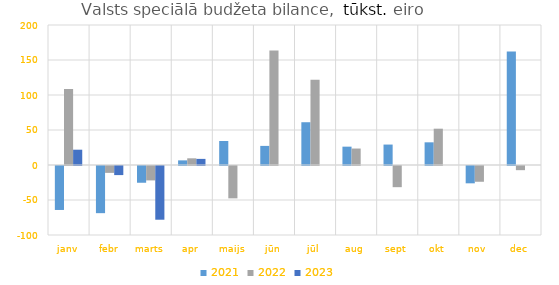
| Category | 2021 | 2022 | 2023 |
|---|---|---|---|
| janv | -62808.075 | 108554.179 | 21850.373 |
| febr | -67375.438 | -9818.538 | -12989.478 |
| marts | -23930.666 | -20590.078 | -76739.856 |
| apr | 6610.878 | 9551.101 | 8730.038 |
| maijs | 34323.187 | -46228.723 | 0 |
| jūn | 27288.039 | 163534.283 | 0 |
| jūl | 61101.998 | 121861.127 | 0 |
| aug | 26197.43 | 23515.069 | 0 |
| sept | 29202.435 | -30249.526 | 0 |
| okt | 32397.037 | 51869.404 | 0 |
| nov | -24738.863 | -22523.369 | 0 |
| dec | 162256.524 | -5948.69 | 0 |